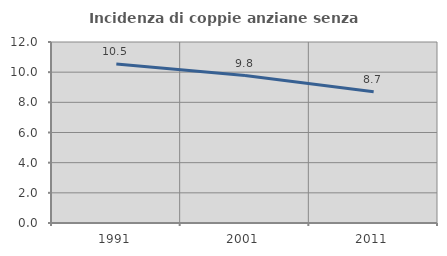
| Category | Incidenza di coppie anziane senza figli  |
|---|---|
| 1991.0 | 10.547 |
| 2001.0 | 9.774 |
| 2011.0 | 8.696 |